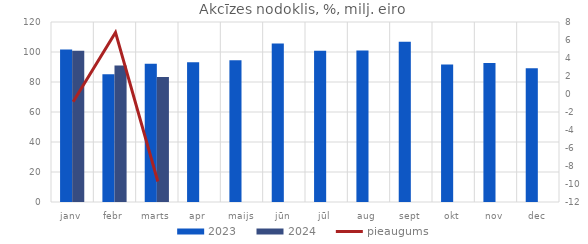
| Category | 2023 | 2024 |
|---|---|---|
| janv | 101.657 | 100.784 |
| febr | 85.2 | 91.033 |
| marts | 92.239 | 83.272 |
| apr | 93.144 | 0 |
| maijs | 94.582 | 0 |
| jūn | 105.706 | 0 |
| jūl | 100.823 | 0 |
| aug | 101.01 | 0 |
| sept | 106.898 | 0 |
| okt | 91.658 | 0 |
| nov | 92.614 | 0 |
| dec | 89.239 | 0 |